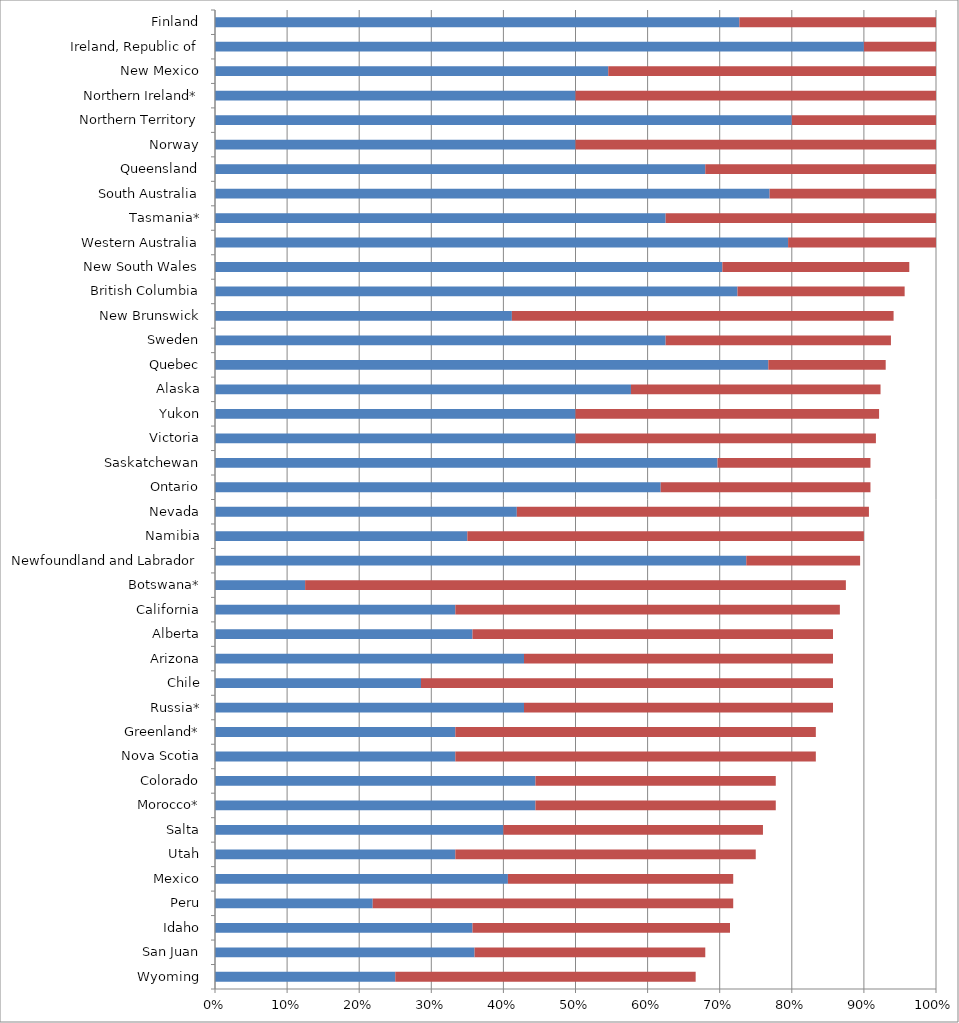
| Category | Series 0 | Series 1 |
|---|---|---|
| Wyoming | 0.25 | 0.417 |
| San Juan | 0.36 | 0.32 |
| Idaho | 0.357 | 0.357 |
| Peru | 0.219 | 0.5 |
| Mexico | 0.406 | 0.312 |
| Utah | 0.333 | 0.417 |
| Salta | 0.4 | 0.36 |
| Morocco* | 0.444 | 0.333 |
| Colorado | 0.444 | 0.333 |
| Nova Scotia | 0.333 | 0.5 |
| Greenland* | 0.333 | 0.5 |
| Russia* | 0.429 | 0.429 |
| Chile | 0.286 | 0.571 |
| Arizona | 0.429 | 0.429 |
| Alberta | 0.357 | 0.5 |
| California | 0.333 | 0.533 |
| Botswana* | 0.125 | 0.75 |
| Newfoundland and Labrador | 0.737 | 0.158 |
| Namibia | 0.35 | 0.55 |
| Nevada | 0.419 | 0.488 |
| Ontario | 0.618 | 0.291 |
| Saskatchewan | 0.697 | 0.212 |
| Victoria | 0.5 | 0.417 |
| Yukon | 0.5 | 0.421 |
| Alaska | 0.577 | 0.346 |
| Quebec | 0.767 | 0.163 |
| Sweden | 0.625 | 0.312 |
| New Brunswick | 0.412 | 0.529 |
| British Columbia | 0.725 | 0.232 |
| New South Wales | 0.704 | 0.259 |
| Western Australia | 0.795 | 0.205 |
| Tasmania* | 0.625 | 0.375 |
| South Australia | 0.769 | 0.231 |
| Queensland | 0.68 | 0.32 |
| Norway | 0.5 | 0.5 |
| Northern Territory | 0.8 | 0.2 |
| Northern Ireland* | 0.5 | 0.5 |
| New Mexico | 0.545 | 0.455 |
| Ireland, Republic of | 0.9 | 0.1 |
| Finland | 0.727 | 0.273 |